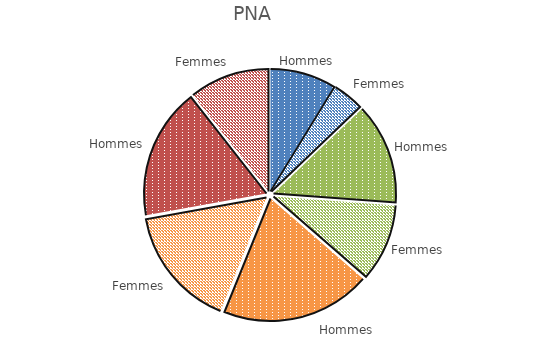
| Category | PNA |
|---|---|
| 0 | 8.755 |
| 1 | 4.113 |
| 2 | 13.314 |
| 3 | 10.214 |
| 4 | 19.763 |
| 5 | 16.032 |
| 6 | 17.28 |
| 7 | 10.577 |